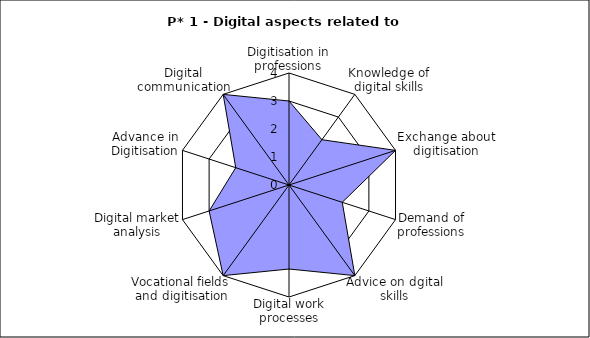
| Category | Series 0 |
|---|---|
| Digitisation in professions | 3 |
| Knowledge of digital skills | 2 |
| Exchange about digitisation | 4 |
| Demand of professions | 2 |
| Advice on dgital skills | 4 |
| Digital work processes | 3 |
| Vocational fields and digitisation | 4 |
| Digital market analysis | 3 |
| Advance in Digitisation | 2 |
| Digital communication | 4 |